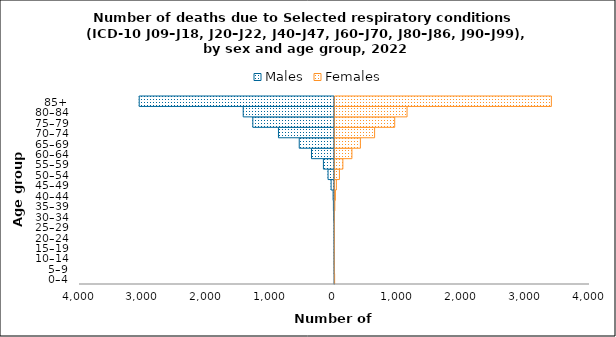
| Category | Males | Females |
|---|---|---|
| 0–4 | -1 | 10 |
| 5–9 | -4 | 3 |
| 10–14 | -5 | 1 |
| 15–19 | -6 | 5 |
| 20–24 | -7 | 6 |
| 25–29 | -7 | 5 |
| 30–34 | -12 | 4 |
| 35–39 | -17 | 13 |
| 40–44 | -22 | 22 |
| 45–49 | -53 | 37 |
| 50–54 | -101 | 85 |
| 55–59 | -174 | 139 |
| 60–64 | -361 | 281 |
| 65–69 | -553 | 414 |
| 70–74 | -879 | 637 |
| 75–79 | -1281 | 952 |
| 80–84 | -1432 | 1146 |
| 85+ | -3063 | 3410 |